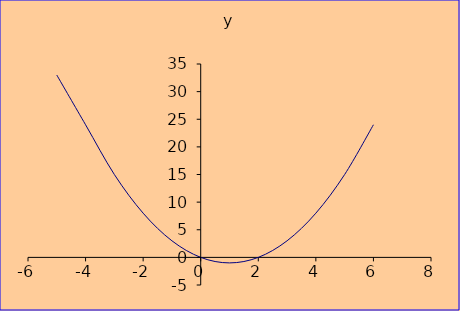
| Category | y |
|---|---|
| -5.0 | 33 |
| -4.0 | 24 |
| -3.0 | 15 |
| -2.0 | 8 |
| -1.0 | 3 |
| 0.0 | 0 |
| 1.0 | -1 |
| 2.0 | 0 |
| 3.0 | 3 |
| 4.0 | 8 |
| 5.0 | 15 |
| 6.0 | 24 |